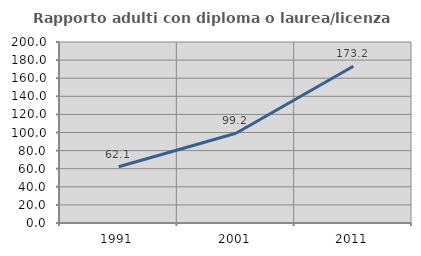
| Category | Rapporto adulti con diploma o laurea/licenza media  |
|---|---|
| 1991.0 | 62.095 |
| 2001.0 | 99.228 |
| 2011.0 | 173.222 |